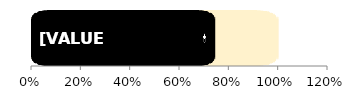
| Category | Men | Women |
|---|---|---|
| 0 | 1 | 0.743 |